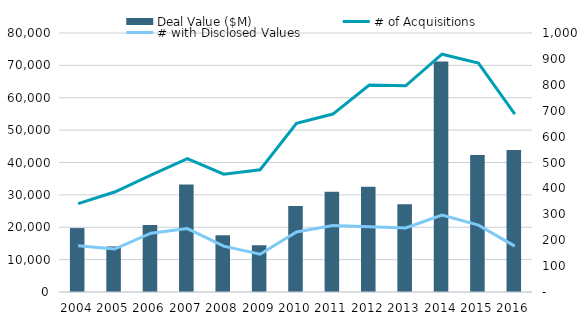
| Category | Deal Value ($M) |
|---|---|
| 2004.0 | 19744.987 |
| 2005.0 | 14086.921 |
| 2006.0 | 20666.51 |
| 2007.0 | 33180.095 |
| 2008.0 | 17523.385 |
| 2009.0 | 14437.035 |
| 2010.0 | 26583.779 |
| 2011.0 | 30956.549 |
| 2012.0 | 32478.463 |
| 2013.0 | 27124.032 |
| 2014.0 | 71176.438 |
| 2015.0 | 42299.536 |
| 2016.0 | 43894.575 |